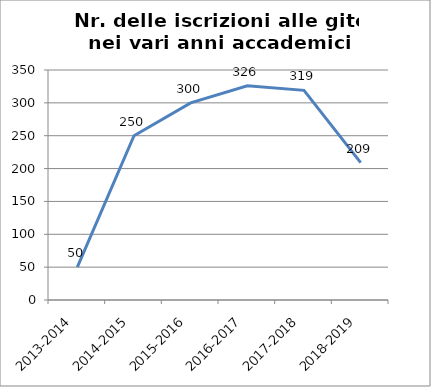
| Category | Nr. Iscrizioni alle Gite |
|---|---|
| 2013-2014 | 50 |
| 2014-2015 | 250 |
| 2015-2016 | 300 |
| 2016-2017 | 326 |
| 2017-2018 | 319 |
| 2018-2019 | 209 |